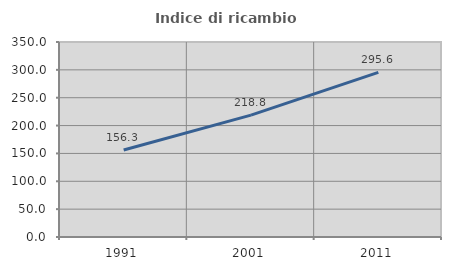
| Category | Indice di ricambio occupazionale  |
|---|---|
| 1991.0 | 156.25 |
| 2001.0 | 218.821 |
| 2011.0 | 295.55 |